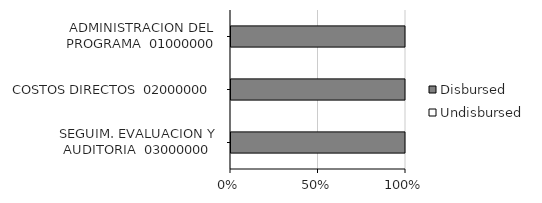
| Category | Disbursed | Undisbursed |
|---|---|---|
| SEGUIM. EVALUACION Y AUDITORIA  03000000 | 29907.14 | 0 |
| COSTOS DIRECTOS  02000000 | 9655135.32 | 0 |
| ADMINISTRACION DEL PROGRAMA  01000000 | 745069.66 | 0 |